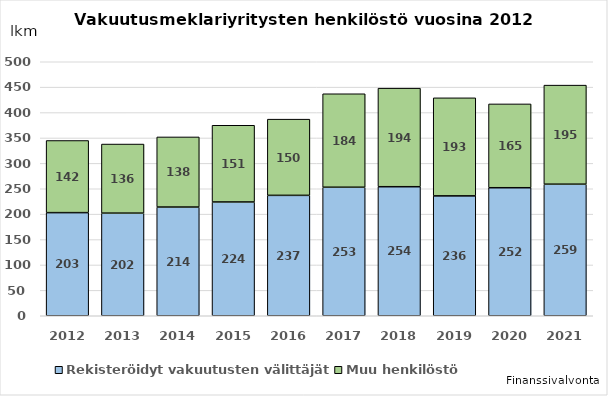
| Category | Rekisteröidyt vakuutusten välittäjät  | Muu henkilöstö |
|---|---|---|
| 2012.0 | 203 | 142 |
| 2013.0 | 202 | 136 |
| 2014.0 | 214 | 138 |
| 2015.0 | 224 | 151 |
| 2016.0 | 237 | 150 |
| 2017.0 | 253 | 184 |
| 2018.0 | 254 | 194 |
| 2019.0 | 236 | 193 |
| 2020.0 | 252 | 165 |
| 2021.0 | 259 | 195 |